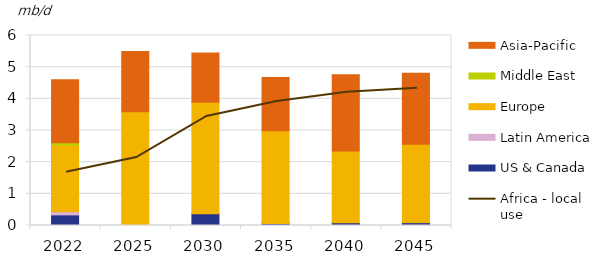
| Category | US & Canada | Latin America | Europe | Middle East | Asia-Pacific |
|---|---|---|---|---|---|
| 2022.0 | 0.335 | 0.1 | 2.1 | 0.08 | 1.986 |
| 2025.0 | 0.003 | -0.002 | 3.585 | 0 | 1.903 |
| 2030.0 | 0.369 | 0 | 3.521 | 0 | 1.557 |
| 2035.0 | 0.065 | 0 | 2.931 | 0 | 1.68 |
| 2040.0 | 0.087 | 0 | 2.267 | 0 | 2.41 |
| 2045.0 | 0.091 | 0.002 | 2.476 | 0 | 2.235 |